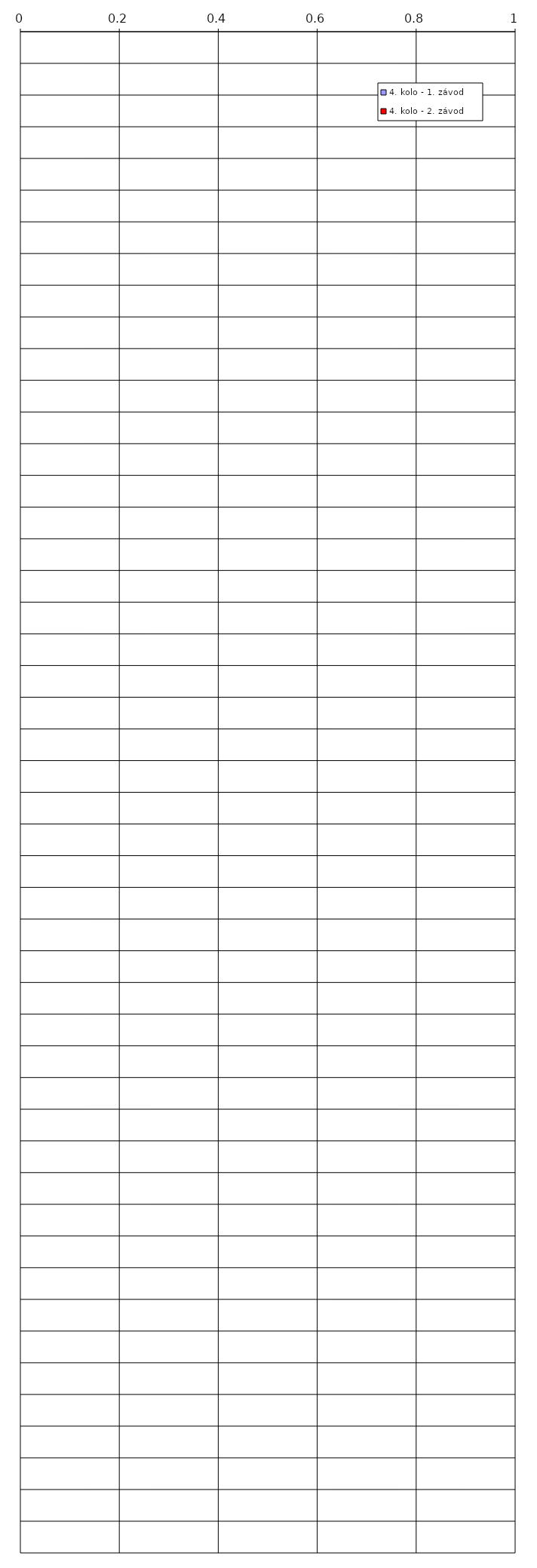
| Category | 4. kolo - 1. závod | 4. kolo - 2. závod |
|---|---|---|
| 0 | 0 | 0 |
| 1 | 0 | 0 |
| 2 | 0 | 0 |
| 3 | 0 | 0 |
| 4 | 0 | 0 |
| 5 | 0 | 0 |
| 6 | 0 | 0 |
| 7 | 0 | 0 |
| 8 | 0 | 0 |
| 9 | 0 | 0 |
| 10 | 0 | 0 |
| 11 | 0 | 0 |
| 12 | 0 | 0 |
| 13 | 0 | 0 |
| 14 | 0 | 0 |
| 15 | 0 | 0 |
| 16 | 0 | 0 |
| 17 | 0 | 0 |
| 18 | 0 | 0 |
| 19 | 0 | 0 |
| 20 | 0 | 0 |
| 21 | 0 | 0 |
| 22 | 0 | 0 |
| 23 | 0 | 0 |
| 24 | 0 | 0 |
| 25 | 0 | 0 |
| 26 | 0 | 0 |
| 27 | 0 | 0 |
| 28 | 0 | 0 |
| 29 | 0 | 0 |
| 30 | 0 | 0 |
| 31 | 0 | 0 |
| 32 | 0 | 0 |
| 33 | 0 | 0 |
| 34 | 0 | 0 |
| 35 | 0 | 0 |
| 36 | 0 | 0 |
| 37 | 0 | 0 |
| 38 | 0 | 0 |
| 39 | 0 | 0 |
| 40 | 0 | 0 |
| 41 | 0 | 0 |
| 42 | 0 | 0 |
| 43 | 0 | 0 |
| 44 | 0 | 0 |
| 45 | 0 | 0 |
| 46 | 0 | 0 |
| 47 | 0 | 0 |